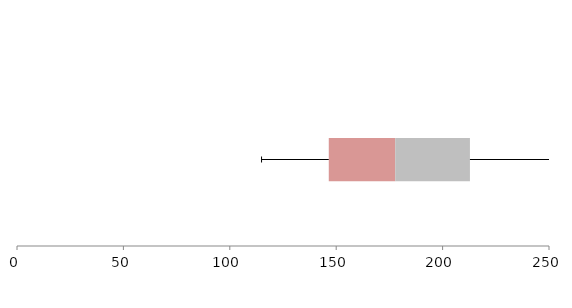
| Category | Series 1 | Series 2 | Series 3 |
|---|---|---|---|
| 0 | 146.512 | 31.221 | 35.115 |